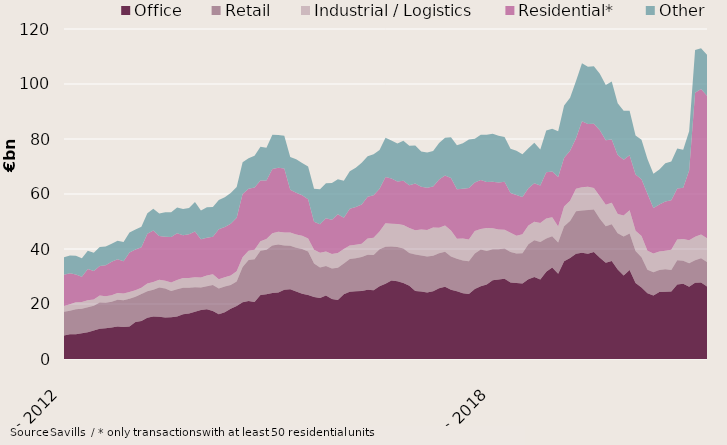
| Category | Office | Retail | Industrial / Logistics | Residential* | Other |
|---|---|---|---|---|---|
| 2012-12-01 | 8504321777 | 8639547669.18 | 2107652642.7 | 11384509003.96 | 6324174971.9 |
| 2013-01-01 | 8967470029 | 8597580631.17 | 2339227123.7 | 11304524746.96 | 6459749914.9 |
| 2013-02-01 | 9042734297.5 | 9076239904.85 | 2499386859.7 | 10148062276.96 | 6769163357.18 |
| 2013-03-01 | 9382899317.14 | 8879175776.35 | 2448956640.7 | 9229456528.32 | 6668642236.18 |
| 2013-04-01 | 9737865550.14 | 9085115744.35 | 2505676640.7 | 11400620541.32 | 6675635417.18 |
| 2013-05-01 | 10330473308.14 | 9039419099.35 | 2286696652.7 | 10308183683.48 | 6691277053.18 |
| 2013-06-01 | 10978757530.14 | 9577681151.78 | 2561696079.7 | 10738835935.44 | 6889015860.68 |
| 2013-07-01 | 11142986962.92 | 9286443584.78 | 2380046000.7 | 11240541620.44 | 6860571232.45 |
| 2013-08-01 | 11443046924.92 | 9376730772.8 | 2332457290 | 12229839822.44 | 6523458565.93 |
| 2013-09-01 | 11813118125.72 | 9699402869.51 | 2519207211.98 | 12284101856.74 | 6702053323.89 |
| 2013-10-01 | 11609579110.72 | 9727861863.57 | 2441069185.98 | 11727008984.54 | 6999037430.89 |
| 2013-11-01 | 11823434614.72 | 10122530032.36 | 2430937190.98 | 14361489005.63 | 7242529719.86 |
| 2013-12-01 | 13486314866.72 | 9187102030.91 | 2347240569.98 | 14839189260.74 | 7207107913.45 |
| 2014-01-01 | 13780730877.72 | 9851068493.92 | 2318485717.98 | 14690274441.74 | 7445499336.45 |
| 2014-02-01 | 15007305331.22 | 9673463303.24 | 2768349976.98 | 18105536458.24 | 7410903668.17 |
| 2014-03-01 | 15491487872.58 | 9654351125.74 | 2833117356.98 | 18788331922.24 | 7865305632.17 |
| 2014-04-01 | 15374141977.58 | 10607660669.74 | 2834100536.98 | 15912594110.24 | 8156058838.17 |
| 2014-05-01 | 15060894833.58 | 10546963482.24 | 2845864408.98 | 15985891426.24 | 8912269938.17 |
| 2014-06-01 | 15158218425.66 | 9544432647.24 | 3105506584.98 | 16600111315.18 | 8957481288.38 |
| 2014-07-01 | 15478732963.88 | 9841966235.24 | 3440852401.98 | 16949735532.68 | 9348736034.61 |
| 2014-08-01 | 16232650242.88 | 9636967715.24 | 3573059549.98 | 15601635374.68 | 9537173270.13 |
| 2014-09-01 | 16583059928.08 | 9353804856.84 | 3506391505.5 | 15963260713.68 | 9536363131.17 |
| 2014-10-01 | 17213987967.08 | 8866837530.84 | 3656699955.5 | 16628034819.88 | 10688452074.17 |
| 2014-11-01 | 17844374967.08 | 8117398128.05 | 3665328905.5 | 13878849559.89 | 10536862158.2 |
| 2014-12-01 | 18081725689.74 | 8390279963.03 | 3920968980.31 | 13670541413.41 | 11111775796.81 |
| 2015-01-01 | 17480642203.74 | 9466254593.03 | 3883908572.31 | 13646785050.41 | 10792640236.82 |
| 2015-02-01 | 16274240230.74 | 9403790983.81 | 3308490268.73 | 18150436996.91 | 10711659377.05 |
| 2015-03-01 | 17035308030.53 | 9365302106.81 | 3368654245.73 | 18257100941.91 | 10814665093.98 |
| 2015-04-01 | 18258922782.53 | 8632001669.81 | 3468694360.68 | 18830450268.91 | 11160418925.98 |
| 2015-05-01 | 19244040473.45 | 8968092469.31 | 3728635607.68 | 19401993150.91 | 11206086418.98 |
| 2015-06-01 | 20628774084.83 | 12835460483.14 | 3559231021.83 | 22972449786.51 | 11551008084.75 |
| 2015-07-01 | 21112087532.5 | 14845940919.21 | 3371725415.86 | 22540107592.35 | 11120198096.21 |
| 2015-08-01 | 20695261632.5 | 15562941505.21 | 3450767146.86 | 22635118357.35 | 11596269263.21 |
| 2015-09-01 | 23317313452.46 | 16001092585.73 | 3520511283.36 | 22065141963.35 | 12239394888.21 |
| 2015-10-01 | 23516812856.46 | 16181040556.36 | 3919085482.36 | 21292965650.35 | 11947737369.21 |
| 2015-11-01 | 23972463618.14 | 17339041737.5 | 4397719316.13 | 23395398176.29 | 12403799285.38 |
| 2015-12-01 | 24223428696.48 | 17455198961.04 | 4557113724.92 | 23319336016.77 | 11921836396.75 |
| 2016-01-01 | 25174915627.48 | 16138997225.45 | 4662502872.92 | 23277671921.77 | 11967817247.24 |
| 2016-02-01 | 25329929348.53 | 15820090497.99 | 4833139363.87 | 15563498654.77 | 11947811922.01 |
| 2016-03-01 | 24570059201.74 | 15865699828.72 | 4877967507.07 | 15108592339.77 | 12258738527.08 |
| 2016-04-01 | 23703143104.74 | 16254770286.07 | 4833846127.82 | 14760671477.37 | 11696815742.08 |
| 2016-05-01 | 23294206506.82 | 15809944380.07 | 4749671116.82 | 14232081715.37 | 11919414936.04 |
| 2016-06-01 | 22501572843.36 | 12232494883.06 | 4999570420.67 | 10189436595.87 | 11965206341.06 |
| 2016-07-01 | 22191433924.69 | 11125435985.56 | 5312245465.64 | 10404072475.53 | 12714721035.96 |
| 2016-08-01 | 23095572073.69 | 10745638868.56 | 5247332254.55 | 12050427222.53 | 12760471635.96 |
| 2016-09-01 | 21794742253.73 | 11145401725.47 | 5270185116.55 | 12465620399.13 | 13320393986.26 |
| 2016-10-01 | 21450269446.86 | 11739208168.84 | 5398267322.55 | 14070034790.02 | 12669133056.83 |
| 2016-11-01 | 23506003086.76 | 11238716740.7 | 5243284144.73 | 11380146617.09 | 13425196679.66 |
| 2016-12-01 | 24468092228.4 | 11930870429.99 | 4886851002.13 | 13331201908.09 | 13681375420.64 |
| 2017-01-01 | 24675768593.4 | 11942263686.96 | 4921244810.37 | 13729696509.09 | 14250866691.58 |
| 2017-02-01 | 24713389622.41 | 12356472437.09 | 4839285725 | 14267858145.09 | 15185668584.58 |
| 2017-03-01 | 25170261511.4 | 12765732178.37 | 5896154543.8 | 15167920484.39 | 14747708325.58 |
| 2017-04-01 | 25008250661.71 | 12830910576.9 | 6258560580.1 | 15489114794.79 | 14851969486.67 |
| 2017-05-01 | 26420856083.47 | 13492885630.15 | 6480202097.1 | 15522287182.8 | 14083438590.28 |
| 2017-06-01 | 27359198504.1 | 13451943478.5 | 8559046401.46 | 16801850396.39 | 14298214208.56 |
| 2017-07-01 | 28566083298.1 | 12300139347.93 | 8320632158.46 | 16480355706.39 | 13778769706.2 |
| 2017-08-01 | 28285172977.1 | 12408029136.93 | 8383195707.55 | 15442529308.39 | 13849134751.2 |
| 2017-09-01 | 27607830483.45 | 12616830917.94 | 8506558041.55 | 16123359085.78 | 14486501554.74 |
| 2017-10-01 | 26661153964.32 | 11909960273.94 | 9044546430.46 | 15580068614.87 | 14351240861.17 |
| 2017-11-01 | 24728535385.17 | 13314421843.83 | 8799447546.51 | 16947694524.87 | 13849490657.44 |
| 2017-12-01 | 24513417630.53 | 13078578236.48 | 9470343512.7 | 15610704960.87 | 12759017527.48 |
| 2018-01-01 | 24219024273.53 | 13013700645.1 | 9721702683.46 | 15307451168.86 | 12872295093.04 |
| 2018-02-01 | 24590947510.47 | 12985537030.65 | 10213193365.46 | 14917009796.86 | 12890336189.04 |
| 2018-03-01 | 25772438266.48 | 12663577036.64 | 9307934893.46 | 17524767231.49 | 13297726597.02 |
| 2018-04-01 | 26239260459.17 | 12722345110.76 | 9605919650.46 | 18204136136.49 | 13654710808.93 |
| 2018-05-01 | 25176840173.41 | 12092663746.51 | 9488564046.46 | 19015064846.48 | 14830516074.36 |
| 2018-06-01 | 24619805985.78 | 11810463263.34 | 7330050155.1 | 17955943579.56 | 16022655962.08 |
| 2018-07-01 | 23897232823.78 | 11960863126.32 | 7966869588.1 | 18082211683.56 | 16514108766.19 |
| 2018-08-01 | 23631217227.76 | 11885701905.19 | 7898300709.1 | 18779877058.41 | 17667527641.04 |
| 2018-09-01 | 25478200690.41 | 12927853979.55 | 8136141438.1 | 17594307591.42 | 15998426541.21 |
| 2018-10-01 | 26428322940.41 | 13398765782.82 | 7412735586.25 | 17806279798.32 | 16500489800.21 |
| 2018-11-01 | 27102721403.45 | 12145908934.88 | 8401198728.54 | 16739676352.32 | 17199430194.25 |
| 2018-12-01 | 28655175031.45 | 11248285254.68 | 7673095490.35 | 16903534102.32 | 17410832515.26 |
| 2019-01-01 | 28881677192.45 | 10984616615.68 | 7220623719.35 | 17089851283.2 | 17011641609.26 |
| 2019-02-01 | 29153984861.45 | 10992187442.4 | 6837562259.96 | 17443099230.2 | 16288670799.62 |
| 2019-03-01 | 27779834171.45 | 11171202657.26 | 6991519187.16 | 14403850111.27 | 16138588186.64 |
| 2019-04-01 | 27660063728.31 | 10721779269.12 | 6440787186.06 | 14819462716.14 | 16122027674.89 |
| 2019-05-01 | 27411606224.31 | 11007377577.12 | 6930931752.06 | 13546461129.14 | 15591702370.89 |
| 2019-06-01 | 28981375466.82 | 12738169920.09 | 6808322697.06 | 13582021303.47 | 14498193682.96 |
| 2019-07-01 | 29836478466.29 | 13385300761.26 | 6721738121.06 | 13965040868.47 | 14698594837.92 |
| 2019-08-01 | 28932944882.31 | 13638029313.39 | 6847156982.06 | 13700485358.62 | 13056753149.07 |
| 2019-09-01 | 31740495687.25 | 12091023494.97 | 7236155171.92 | 16808223801.62 | 15208053471.17 |
| 2019-10-01 | 33266807249.25 | 11371608887.7 | 6870917898.86 | 16650274404.74 | 15543023722.17 |
| 2019-11-01 | 30998345096.78 | 11335647756.75 | 5862593126.57 | 17999098699.74 | 16608257247.86 |
| 2019-12-01 | 35527691128.49 | 12748435551.88 | 7193076149.23 | 17715667348.74 | 18988776442.82 |
| 2020-01-01 | 36701466860.49 | 13455205119.88 | 7418333450.23 | 18152920102.87 | 19298443060.82 |
| 2020-02-01 | 38253570613.44 | 15518583828.37 | 8118849336.38 | 18347811221.37 | 20876955510.54 |
| 2020-03-01 | 38661114818.89 | 15361758647.15 | 8435638262.18 | 24034093487.37 | 21087830921.12 |
| 2020-04-01 | 38306762938.03 | 15876632879.17 | 8421581433.28 | 22892151936.5 | 20818918971.87 |
| 2020-05-01 | 38874029574.03 | 15517202993.17 | 7833704033.28 | 23320141777.5 | 20907392846.83 |
| 2020-06-01 | 36825932126.52 | 14166673820.21 | 8153642308.28 | 24041398462.5 | 20572849639.76 |
| 2020-07-01 | 35038901674.05 | 13206002556.06 | 7858106953.28 | 23454894941.5 | 20046619490.06 |
| 2020-08-01 | 35631965111.05 | 13340195992.06 | 7864692000.28 | 22961788157.5 | 21150990421.55 |
| 2020-09-01 | 32515990383.11 | 13251359673.68 | 6961195944.42 | 21430453702.49 | 18831855953.08 |
| 2020-10-01 | 30357242112.11 | 14173883253.68 | 7625238129.42 | 20314229725.49 | 17841894371.54 |
| 2020-11-01 | 32387193464.11 | 13264654126.68 | 8422802908.42 | 20031748385.49 | 16141331591.98 |
| 2020-12-01 | 27661146779.4 | 11619042101.74 | 7340810853.76 | 20448638435.49 | 14201491952.88 |
| 2021-01-01 | 25978755162.4 | 11039497747.74 | 7676907719.76 | 20665419315.49 | 14332310879.79 |
| 2021-02-01 | 23889111055.45 | 8570163915.53 | 6938860723 | 20669874697.99 | 12688701255.47 |
| 2021-03-01 | 23068337137 | 8479014457.89 | 6789691146.99 | 16605782848.99 | 12424705480.25 |
| 2021-04-01 | 24325317320 | 8069753506.01 | 6669014867.99 | 17153757013.99 | 12650159254.25 |
| 2021-05-01 | 24472986088 | 8203956491.01 | 6688135128.99 | 17918074016.99 | 13865997709.29 |
| 2021-06-01 | 24539689945 | 7841565938 | 7330984208.99 | 17984130212.99 | 14137028508.91 |
| 2021-07-01 | 27110626580 | 8811276187 | 7562676605.99 | 18543759487.74 | 14549275910.54 |
| 2021-08-01 | 27345698655 | 8408714112 | 7850085331.96 | 18659329563.74 | 13804286223.05 |
| 2021-09-01 | 26302195977 | 8481091780.91 | 8390306330.96 | 25369592846.75 | 14276036303.41 |
| 2021-10-01 | 27689609424.69 | 8232227143.91 | 8537942460.96 | 52340700967.75 | 15574634646.32 |
| 2021-11-01 | 27834406022.69 | 8817119107.91 | 8590090134.96 | 52915596408.75 | 14869795688.88 |
| 2021-12-01 | 26360286331.69 | 8890621408.91 | 8643636061.96 | 51790477388.25 | 14906533482.02 |